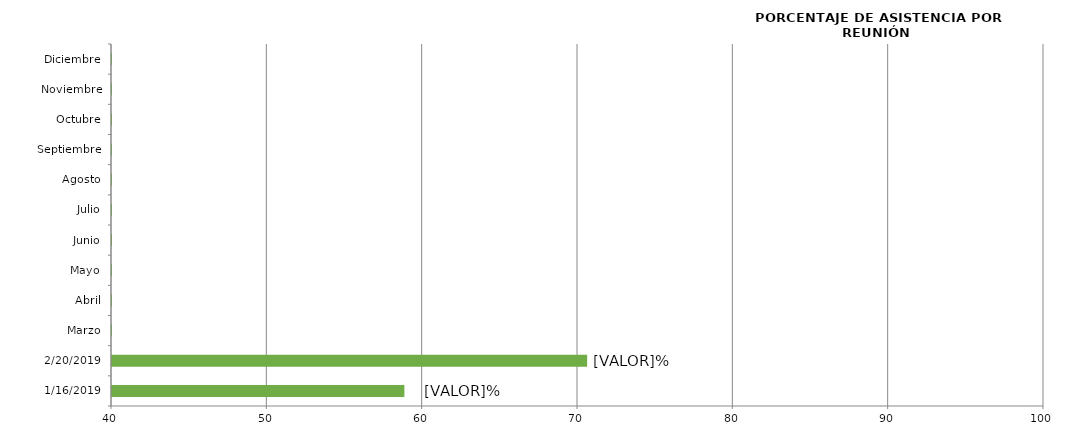
| Category | Series 0 |
|---|---|
| 16/01/2019 | 58.824 |
| 20/02/2019 | 70.588 |
| Marzo | 0 |
| Abril | 0 |
| Mayo | 0 |
| Junio | 0 |
| Julio | 0 |
| Agosto | 0 |
| Septiembre | 0 |
| Octubre | 0 |
| Noviembre | 0 |
| Diciembre | 0 |